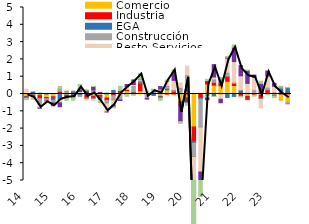
| Category | Comercio | Industria | EGA | Construcción | Resto Servicios | Servicios personales | Agro y Pesca |
|---|---|---|---|---|---|---|---|
| 14 | -0.145 | -0.021 | -0.05 | -0.002 | 0.283 | -0.028 | -0.088 |
| 14.T2 | -0.064 | 0.067 | 0.05 | -0.006 | -0.008 | -0.053 | -0.178 |
| 14.T3 | -0.094 | -0.173 | 0.04 | -0.326 | -0.215 | -0.016 | 0.018 |
| 14.T4 | -0.2 | -0.076 | 0.012 | -0.084 | -0.045 | -0.028 | -0.033 |
| 15 | -0.159 | -0.071 | -0.14 | -0.088 | -0.061 | -0.161 | 0.006 |
| 15.T2 | 0.071 | 0.087 | -0.319 | 0.174 | -0.193 | -0.226 | 0.1 |
| 15.T3 | -0.087 | -0.076 | 0.02 | 0.135 | 0.032 | -0.103 | -0.108 |
| 15.T4 | -0.03 | -0.1 | 0.131 | -0.018 | 0.078 | -0.022 | -0.192 |
| 16 | 0.01 | -0.028 | -0.064 | -0.061 | 0.13 | 0.15 | 0.263 |
| 16.T2 | -0.081 | -0.161 | 0.001 | -0.019 | -0.094 | 0.215 | 0.006 |
| 16.T3 | -0.13 | -0.07 | -0.047 | 0.232 | -0.134 | 0.202 | 0.005 |
| 16.T4 | -0.087 | -0.097 | -0.125 | 0.081 | -0.128 | 0.013 | -0.071 |
| 17 | -0.233 | -0.137 | 0.001 | -0.141 | -0.527 | -0.003 | 0.067 |
| 17.T2 | 0.071 | -0.089 | 0.137 | -0.246 | -0.324 | -0.088 | -0.055 |
| 17.T3 | 0.073 | 0.095 | 0.041 | -0.329 | -0.023 | -0.023 | 0.231 |
| 17.T4 | 0.192 | 0.025 | -0.018 | -0.005 | 0.214 | 0.117 | -0.106 |
| 18 | -0.011 | 0.106 | 0.025 | 0.296 | 0.123 | 0.269 | -0.067 |
| 18.T2 | 0.19 | 0.417 | 0.093 | 0.002 | 0.127 | 0.028 | 0.297 |
| 18.T3 | -0.018 | 0.078 | -0.015 | -0.162 | -0.067 | -0.034 | 0.086 |
| 18.T4 | 0.047 | -0.01 | -0.072 | 0.111 | 0.085 | 0.022 | 0.002 |
| 19 | -0.138 | -0.026 | -0.074 | 0.288 | 0.015 | 0.126 | -0.134 |
| 19.T2 | 0.239 | -0.004 | 0.097 | 0.098 | 0.295 | 0.007 | 0.074 |
| 19.T3 | -0.014 | 0.163 | 0.004 | 0.01 | 0.612 | 0.448 | 0.164 |
| 19.T4 | -0.449 | -0.128 | -0.045 | 0.326 | 0.314 | -0.976 | -0.102 |
| 20 | -0.218 | 0.057 | -0.017 | 0.994 | 0.567 | -0.283 | -0.14 |
| 20.T2 | -1.904 | -0.827 | -0.117 | -0.767 | -4.117 | -3.119 | -0.062 |
| 20.T3 | 0.05 | -0.227 | -0.072 | -1.611 | -2.6 | -1.464 | -0.073 |
| 20.T4 | 0.584 | 0.187 | 0.008 | -0.071 | -0.16 | -0.098 | 0.069 |
| 21 | 0.515 | 0.16 | -0.141 | 0.131 | 0.177 | 0.714 | -0.004 |
| 21.T2 | 0.48 | 0.128 | 0.247 | 0.07 | -0.305 | -0.202 | 0.024 |
| 21.T3 | 0.741 | 0.287 | -0.206 | 0.17 | 0.871 | 0.055 | 0.05 |
| 21.T4 | 0.493 | 0.124 | -0.139 | 0.001 | 1.255 | 0.828 | 0.132 |
| 22 | 0.058 | -0.128 | 0.144 | 0.001 | 0.849 | 0.586 | -0.052 |
| 22.T2 | -0.135 | -0.173 | -0.018 | 0.041 | 0.572 | 0.748 | 0.017 |
| 22.T3 | 0.041 | -0.061 | 0.001 | 0.147 | 0.777 | 0.129 | -0.062 |
| 22.T4 | -0.06 | -0.174 | -0.012 | 0.051 | -0.553 | 0.561 | 0.128 |
| 23 | 0.095 | 0.141 | 0.013 | 0.091 | 0.698 | 0.29 | -0.051 |
| 23.T2 | -0.099 | -0.024 | 0.014 | 0.044 | 0.39 | 0.173 | -0.084 |
| 23.T3 | -0.333 | 0.015 | 0.33 | 0.085 | -0.052 | 0.006 | 0.01 |
| 23.T4 | -0.475 | 0.101 | 0.262 | -0.076 | -0.051 | 0.003 | 0.018 |